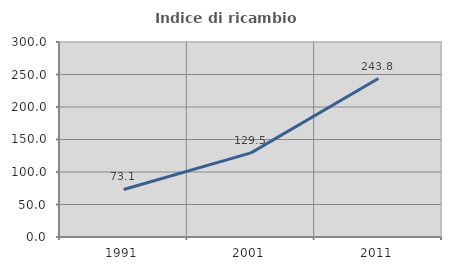
| Category | Indice di ricambio occupazionale  |
|---|---|
| 1991.0 | 73.113 |
| 2001.0 | 129.455 |
| 2011.0 | 243.75 |